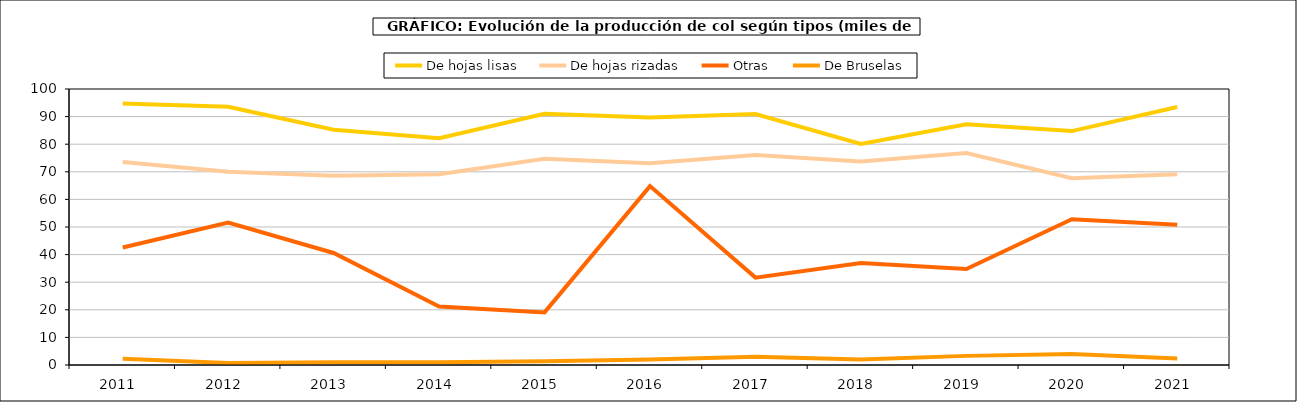
| Category | De hojas lisas | De hojas rizadas | Otras | De Bruselas |
|---|---|---|---|---|
| 2011.0 | 94.724 | 73.591 | 42.575 | 2.237 |
| 2012.0 | 93.549 | 70.008 | 51.596 | 0.731 |
| 2013.0 | 85.207 | 68.536 | 40.593 | 0.965 |
| 2014.0 | 82.165 | 69.098 | 21.166 | 1.025 |
| 2015.0 | 91.025 | 74.746 | 19.06 | 1.371 |
| 2016.0 | 89.719 | 73.058 | 64.818 | 2.023 |
| 2017.0 | 90.922 | 76.042 | 31.66 | 2.985 |
| 2018.0 | 80.113 | 73.721 | 36.915 | 1.984 |
| 2019.0 | 87.207 | 76.809 | 34.763 | 3.306 |
| 2020.0 | 84.743 | 67.663 | 52.8 | 4.02 |
| 2021.0 | 93.471 | 69.125 | 50.826 | 2.339 |